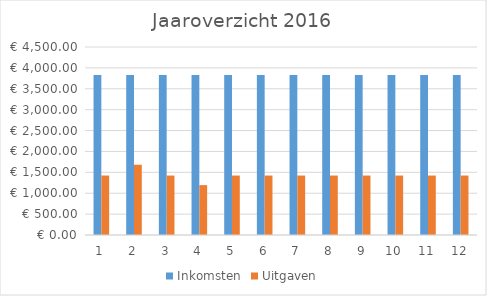
| Category | Inkomsten | Uitgaven |
|---|---|---|
| 0 | 3828 | 1423.15 |
| 1 | 3828 | 1681.25 |
| 2 | 3828 | 1423.15 |
| 3 | 3828 | 1193.5 |
| 4 | 3828 | 1423.15 |
| 5 | 3828 | 1423.15 |
| 6 | 3828 | 1423.15 |
| 7 | 3828 | 1423.15 |
| 8 | 3828 | 1423.15 |
| 9 | 3828 | 1423.15 |
| 10 | 3828 | 1423.15 |
| 11 | 3828 | 1423.15 |